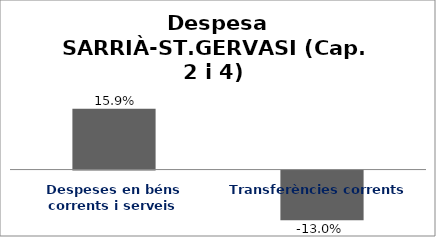
| Category | Series 0 |
|---|---|
| Despeses en béns corrents i serveis | 0.159 |
| Transferències corrents | -0.13 |